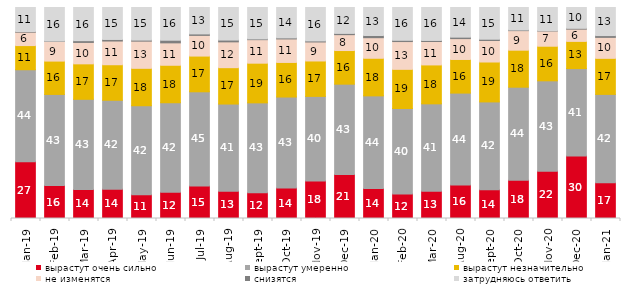
| Category | вырастут очень сильно | вырастут умеренно | вырастут незначительно | не изменятся | снизятся | затрудняюсь ответить |
|---|---|---|---|---|---|---|
| 2019-01-01 | 26.85 | 43.65 | 11.45 | 6.35 | 0.3 | 11.4 |
| 2019-02-01 | 15.6 | 43.2 | 15.8 | 9.35 | 0.15 | 15.9 |
| 2019-03-01 | 13.774 | 42.715 | 16.808 | 10.144 | 0.845 | 15.714 |
| 2019-04-01 | 13.911 | 42.129 | 16.832 | 11.238 | 0.743 | 15.149 |
| 2019-05-01 | 11.293 | 42.15 | 17.732 | 12.878 | 0.495 | 15.453 |
| 2019-06-01 | 12.419 | 42.444 | 17.756 | 10.623 | 1.247 | 15.511 |
| 2019-07-01 | 15.396 | 44.653 | 16.931 | 9.802 | 0.693 | 12.525 |
| 2019-08-01 | 12.887 | 41.359 | 17.233 | 12.238 | 0.849 | 15.435 |
| 2019-09-01 | 12.228 | 42.574 | 18.812 | 11.139 | 0.347 | 14.901 |
| 2019-10-01 | 14.455 | 43.119 | 16.386 | 11.139 | 0.495 | 14.406 |
| 2019-11-01 | 17.772 | 40.099 | 16.782 | 9.01 | 0.495 | 15.842 |
| 2019-12-01 | 20.891 | 42.772 | 15.941 | 7.525 | 0.594 | 12.277 |
| 2020-01-01 | 14.208 | 43.911 | 17.822 | 9.752 | 1.04 | 13.267 |
| 2020-02-01 | 11.634 | 40.495 | 18.564 | 13.168 | 0.594 | 15.545 |
| 2020-03-01 | 12.94 | 41.398 | 18.443 | 11.106 | 0.496 | 15.617 |
| 2020-08-01 | 15.839 | 43.595 | 15.938 | 9.881 | 0.695 | 14.052 |
| 2020-09-01 | 13.639 | 41.613 | 18.915 | 10.204 | 0.597 | 15.032 |
| 2020-10-01 | 18.137 | 44.096 | 17.539 | 9.268 | 0.299 | 10.663 |
| 2020-11-01 | 22.4 | 42.85 | 16.4 | 7.2 | 0.15 | 11 |
| 2020-12-01 | 29.598 | 41.448 | 12.89 | 5.801 | 0.397 | 9.866 |
| 2021-01-01 | 16.89 | 41.927 | 17.089 | 9.935 | 0.845 | 13.313 |